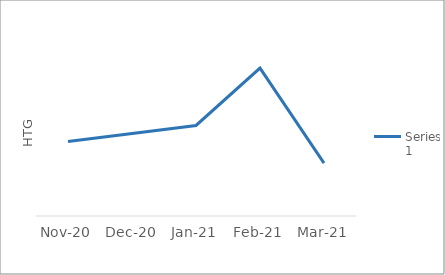
| Category | Series 0 |
|---|---|
| 2020-11-01 | 12528.445 |
| 2021-01-01 | 12642.946 |
| 2021-02-01 | 13050.013 |
| 2021-03-01 | 12375.169 |